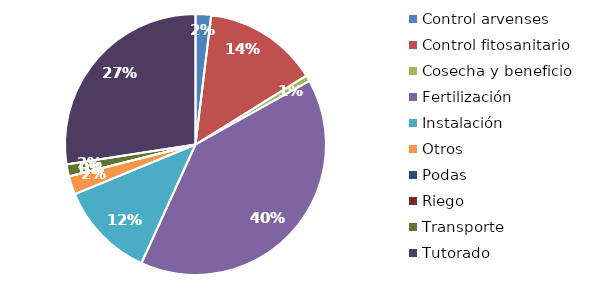
| Category | Valor |
|---|---|
| Control arvenses | 115731 |
| Control fitosanitario | 856934 |
| Cosecha y beneficio | 44737.987 |
| Fertilización | 2401705 |
| Instalación | 721140 |
| Otros | 137655 |
| Podas | 0 |
| Riego | 0 |
| Transporte | 89505 |
| Tutorado | 1651864 |